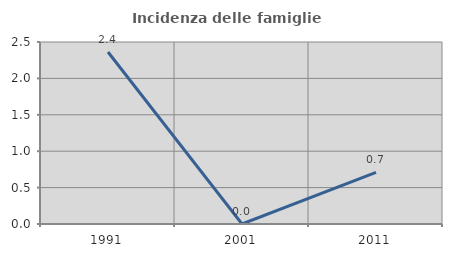
| Category | Incidenza delle famiglie numerose |
|---|---|
| 1991.0 | 2.362 |
| 2001.0 | 0 |
| 2011.0 | 0.709 |